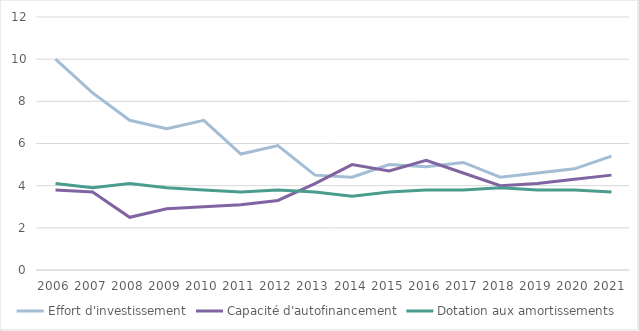
| Category | Effort d'investissement | Capacité d'autofinancement | Dotation aux amortissements |
|---|---|---|---|
| 2006.0 | 10 | 3.8 | 4.1 |
| 2007.0 | 8.4 | 3.7 | 3.9 |
| 2008.0 | 7.1 | 2.5 | 4.1 |
| 2009.0 | 6.7 | 2.9 | 3.9 |
| 2010.0 | 7.1 | 3 | 3.8 |
| 2011.0 | 5.5 | 3.1 | 3.7 |
| 2012.0 | 5.9 | 3.3 | 3.8 |
| 2013.0 | 4.5 | 4.1 | 3.7 |
| 2014.0 | 4.4 | 5 | 3.5 |
| 2015.0 | 5 | 4.7 | 3.7 |
| 2016.0 | 4.9 | 5.2 | 3.8 |
| 2017.0 | 5.1 | 4.6 | 3.8 |
| 2018.0 | 4.4 | 4 | 3.9 |
| 2019.0 | 4.6 | 4.1 | 3.8 |
| 2020.0 | 4.8 | 4.3 | 3.8 |
| 2021.0 | 5.4 | 4.5 | 3.7 |